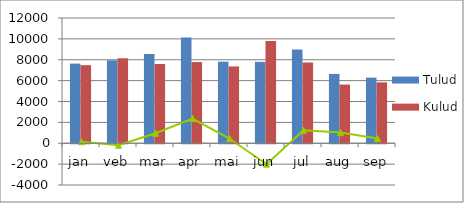
| Category | Tulud | Kulud |
|---|---|---|
| jan | 7632.244 | 7482.976 |
| veb | 7948.49 | 8132.524 |
| mar | 8554.697 | 7594.297 |
| apr | 10143.186 | 7777.954 |
| mai | 7812.128 | 7358.516 |
| jun | 7799.047 | 9807.418 |
| jul | 8988.78 | 7739.049 |
| aug | 6641.59 | 5623.076 |
| sep | 6287.938 | 5833.793 |